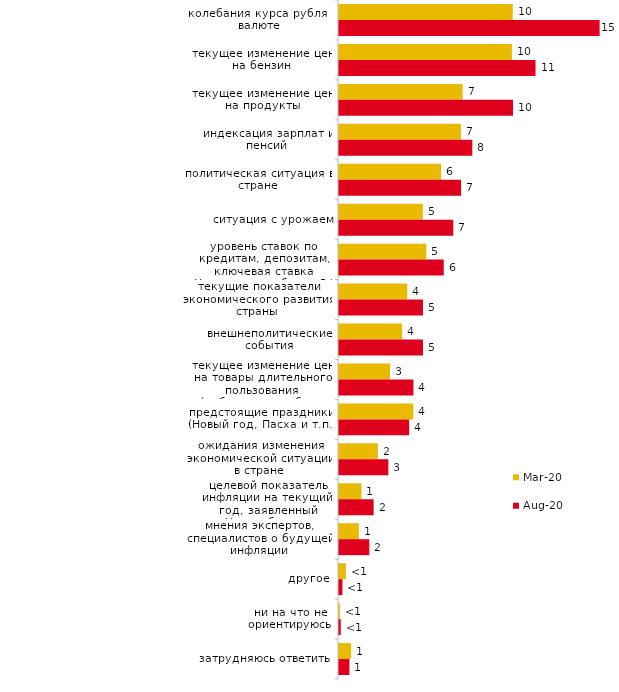
| Category | мар.20 | авг.20 |
|---|---|---|
| колебания курса рубля к валюте | 9.965 | 14.945 |
| текущее изменение цен на бензин | 9.916 | 11.271 |
| текущее изменение цен на продукты | 7.09 | 9.98 |
| индексация зарплат и пенсий | 6.991 | 7.646 |
| политическая ситуация в стране | 5.85 | 7.001 |
| ситуация с урожаем | 4.809 | 6.554 |
| уровень ставок по кредитам, депозитам, ключевая ставка Центрального банка РФ | 5.007 | 6.008 |
| текущие показатели экономического развития страны | 3.917 | 4.816 |
| внешнеполитические события | 3.619 | 4.816 |
| текущее изменение цен на товары длительного пользования (мебель, автомобиль, бытовая техника и т.п.) | 2.925 | 4.27 |
| предстоящие праздники (Новый год, Пасха и т.п.) | 4.264 | 4.022 |
| ожидания изменения экономической ситуации в стране | 2.231 | 2.83 |
| целевой показатель инфляции на текущий год, заявленный Центробанком | 1.289 | 1.986 |
| мнения экспертов, специалистов о будущей инфляции | 1.14 | 1.738 |
| другое | 0.397 | 0.199 |
| ни на что не ориентируюсь | 0.05 | 0.099 |
| затрудняюсь ответить | 0.694 | 0.596 |